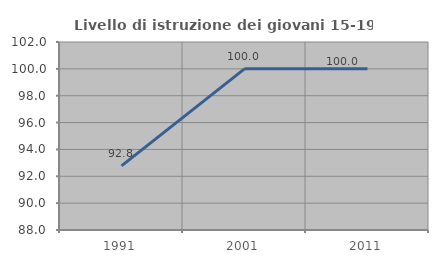
| Category | Livello di istruzione dei giovani 15-19 anni |
|---|---|
| 1991.0 | 92.771 |
| 2001.0 | 100 |
| 2011.0 | 100 |